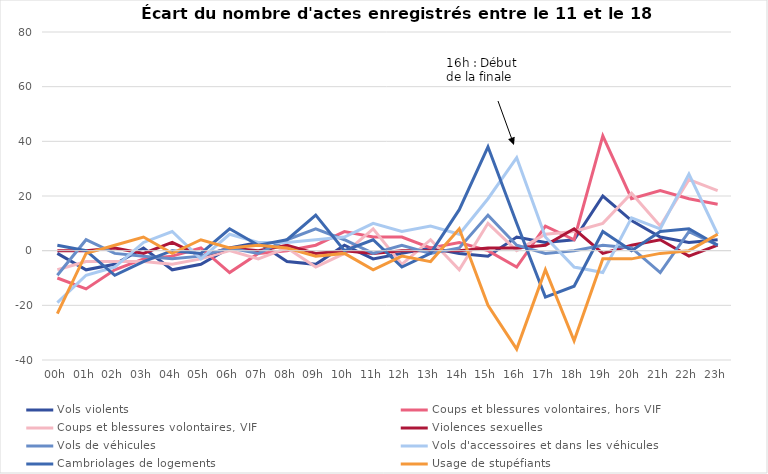
| Category | Vols violents | Coups et blessures volontaires, hors VIF  | Coups et blessures volontaires, VIF  | Violences sexuelles  | Vols de véhicules | Vols d'accessoires et dans les véhicules  | Cambriolages de logements  | Usage de stupéfiants |
|---|---|---|---|---|---|---|---|---|
| 00h | -1 | -10 | -7 | 0 | -9 | -19 | 2 | -23 |
| 01h | -7 | -14 | -4 | 0 | 4 | -9 | 0 | -1 |
| 02h | -5 | -7 | -4 | 1 | -1 | -6 | -9 | 2 |
| 03h | 1 | -3 | -4 | -1 | -2 | 3 | -4 | 5 |
| 04h | -7 | -2 | -5 | 3 | -3 | 7 | 0 | -1 |
| 05h | -5 | 1 | -3 | -2 | -2 | -3 | -1 | 4 |
| 06h | 1 | -8 | 0 | 1 | 1 | 6 | 8 | 1 |
| 07h | 3 | -1 | -3 | 0 | -1 | 3 | 2 | 2 |
| 08h | -4 | 0 | 1 | 2 | 4 | 3 | 4 | 1 |
| 09h | -5 | 2 | -6 | -1 | 8 | 4 | 13 | -2 |
| 10h | 2 | 7 | -1 | 0 | 4 | 5 | 0 | -1 |
| 11h | -3 | 5 | 8 | -1 | -1 | 10 | 4 | -7 |
| 12h | -1 | 5 | -5 | 0 | 2 | 7 | -6 | -2 |
| 13h | 1 | 1 | 4 | 0 | -1 | 9 | -1 | -4 |
| 14h | -1 | 3 | -7 | 0 | 1 | 6 | 15 | 8 |
| 15h | -2 | 0 | 10 | 1 | 13 | 19 | 38 | -20 |
| 16h | 5 | -6 | 0 | 1 | 2 | 34 | 10 | -36 |
| 17h | 3 | 9 | 6 | 2 | -1 | 5 | -17 | -7 |
| 18h | 4 | 4 | 7 | 8 | 0 | -6 | -13 | -33 |
| 19h | 20 | 42 | 10 | -1 | 2 | -8 | 7 | -3 |
| 20h | 11 | 19 | 21 | 2 | 1 | 12 | 0 | -3 |
| 21h | 5 | 22 | 9 | 4 | -8 | 8 | 7 | -1 |
| 22h | 3 | 19 | 26 | -2 | 7 | 28 | 8 | 0 |
| 23h | 4 | 17 | 22 | 2 | 2 | 6 | 2 | 6 |